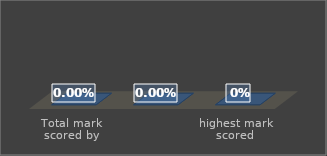
| Category | Series 0 |
|---|---|
| Total mark scored by Student (in %) | 0 |
| Average % marks scored by all Students for all subjects appeared | 0 |
| highest mark scored | 0 |